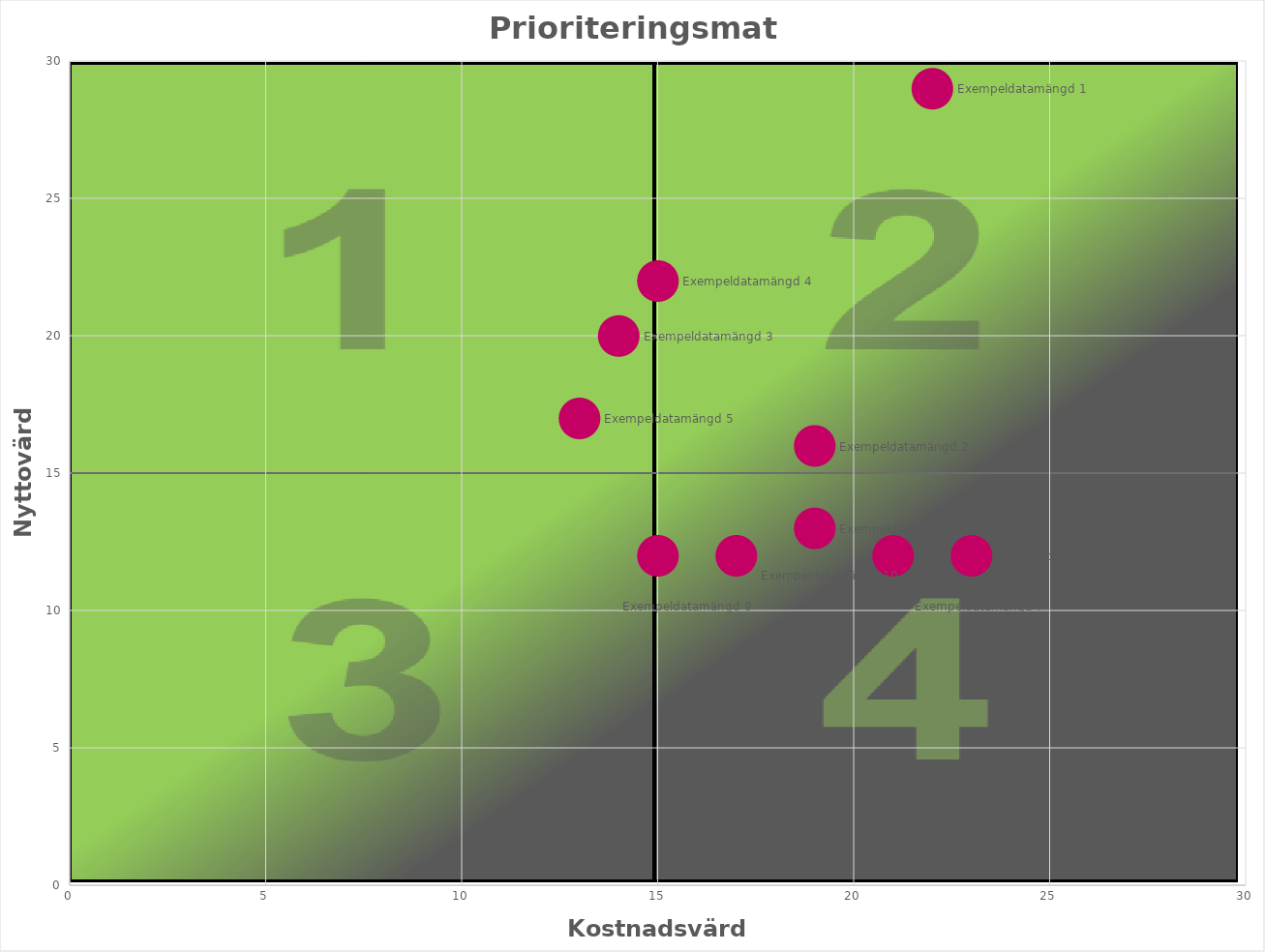
| Category | Series 0 |
|---|---|
| 22.0 | 29 |
| 19.0 | 16 |
| 14.0 | 20 |
| 15.0 | 22 |
| 13.0 | 17 |
| 19.0 | 13 |
| 21.0 | 12 |
| 23.0 | 12 |
| 15.0 | 12 |
| 17.0 | 12 |